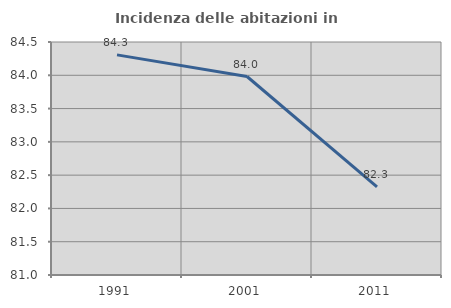
| Category | Incidenza delle abitazioni in proprietà  |
|---|---|
| 1991.0 | 84.307 |
| 2001.0 | 83.982 |
| 2011.0 | 82.323 |